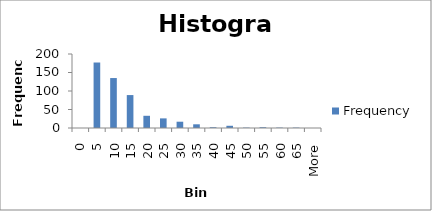
| Category | Frequency |
|---|---|
| 0 | 0 |
| 5 | 177 |
| 10 | 135 |
| 15 | 89 |
| 20 | 33 |
| 25 | 26 |
| 30 | 17 |
| 35 | 10 |
| 40 | 2 |
| 45 | 6 |
| 50 | 1 |
| 55 | 2 |
| 60 | 1 |
| 65 | 1 |
| More | 0 |